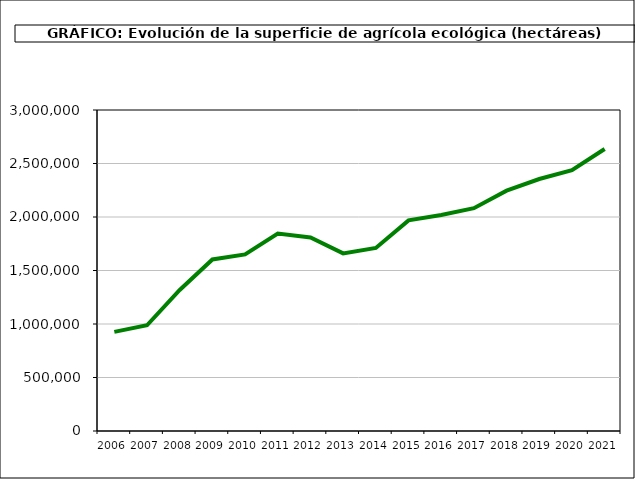
| Category | Superficie (ha) |
|---|---|
| 2006.0 | 926390 |
| 2007.0 | 988323 |
| 2008.0 | 1317752 |
| 2009.0 | 1602868 |
| 2010.0 | 1650866 |
| 2011.0 | 1845039 |
| 2012.0 | 1808492 |
| 2013.0 | 1659916 |
| 2014.0 | 1710493 |
| 2015.0 | 1968570 |
| 2016.0 | 2018802 |
| 2017.0 | 2082173 |
| 2018.0 | 2246475 |
| 2019.0 | 2354915.714 |
| 2020.0 | 2437891.017 |
| 2021.0 | 2635442 |